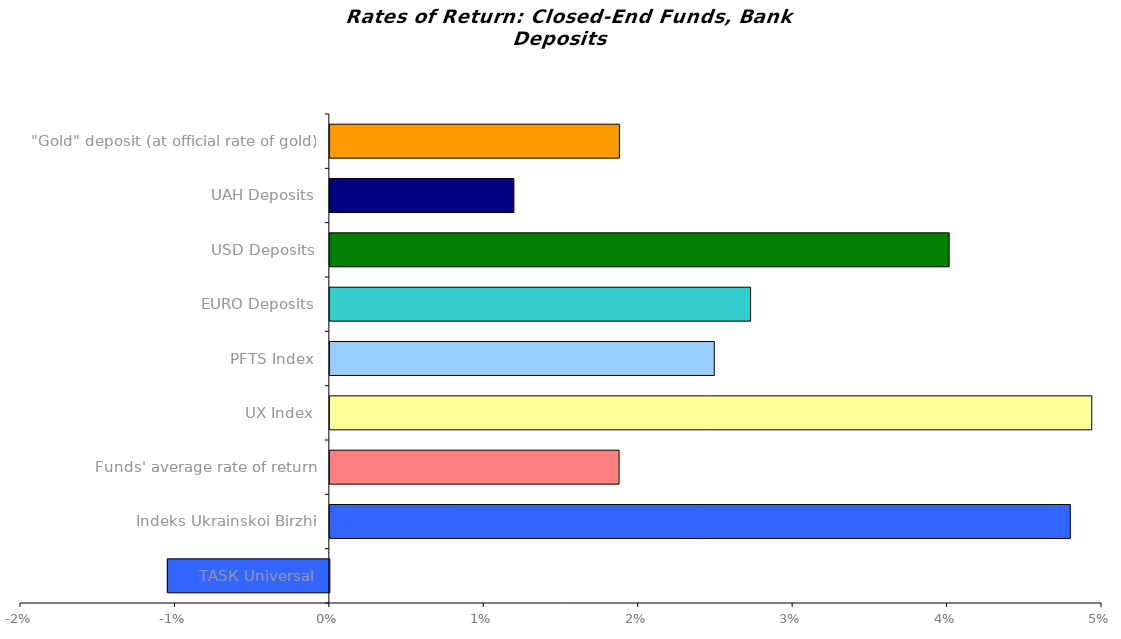
| Category | Series 0 |
|---|---|
| ТАSК Universal | -0.01 |
| Іndeks Ukrainskoi Birzhi | 0.048 |
| Funds' average rate of return | 0.019 |
| UX Index | 0.049 |
| PFTS Index | 0.025 |
| EURO Deposits | 0.027 |
| USD Deposits | 0.04 |
| UAH Deposits | 0.012 |
| "Gold" deposit (at official rate of gold) | 0.019 |